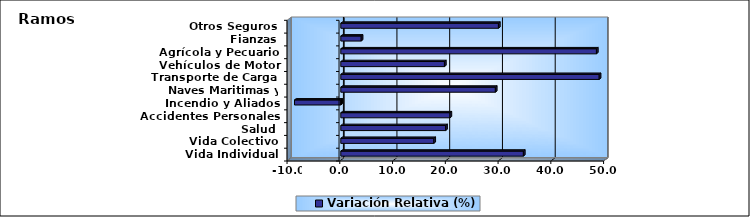
| Category | Variación Relativa (%) |
|---|---|
| Vida Individual | 34.608 |
| Vida Colectivo | 17.632 |
| Salud | 19.872 |
| Accidentes Personales | 20.695 |
| Incendio y Aliados | -8.776 |
| Naves Maritimas y Aéreas | 29.298 |
| Transporte de Carga | 48.978 |
| Vehículos de Motor | 19.646 |
| Agrícola y Pecuario | 48.453 |
| Fianzas | 3.869 |
| Otros Seguros | 29.879 |